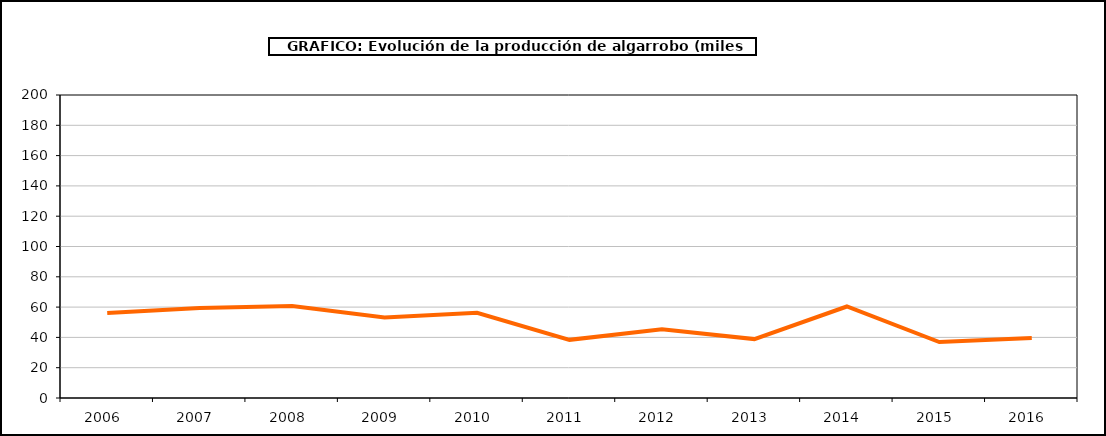
| Category | producción |
|---|---|
| 2006.0 | 56.081 |
| 2007.0 | 59.449 |
| 2008.0 | 60.795 |
| 2009.0 | 53.202 |
| 2010.0 | 56.286 |
| 2011.0 | 38.38 |
| 2012.0 | 45.414 |
| 2013.0 | 38.882 |
| 2014.0 | 60.4 |
| 2015.0 | 36.894 |
| 2016.0 | 39.587 |